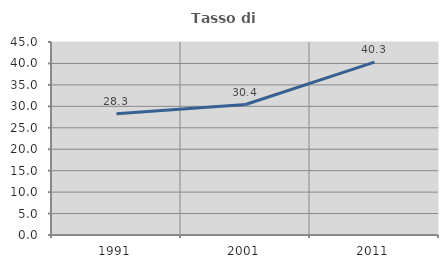
| Category | Tasso di occupazione   |
|---|---|
| 1991.0 | 28.261 |
| 2001.0 | 30.42 |
| 2011.0 | 40.319 |